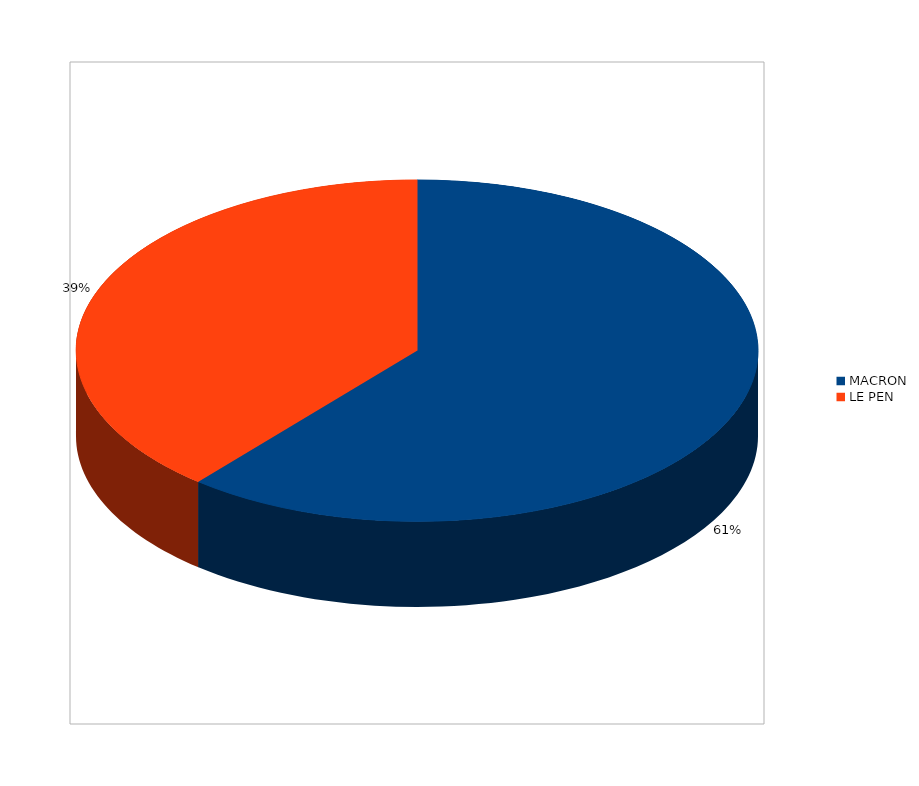
| Category | Series 0 |
|---|---|
| MACRON | 5437 |
| LE PEN | 3465 |